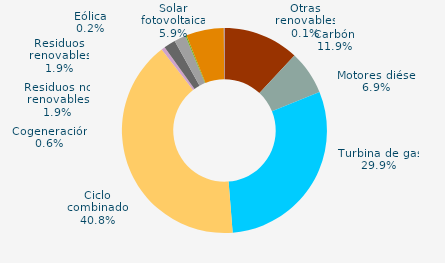
| Category | Series 0 |
|---|---|
| Carbón | 11.949 |
| Motores diésel | 6.906 |
| Turbina de gas | 29.877 |
| Ciclo combinado | 40.766 |
| Generación auxiliar | 0 |
| Cogeneración | 0.571 |
| Residuos no renovables | 1.853 |
| Residuos renovables | 1.853 |
| Eólica | 0.18 |
| Solar fotovoltaica | 5.94 |
| Otras renovables | 0.106 |